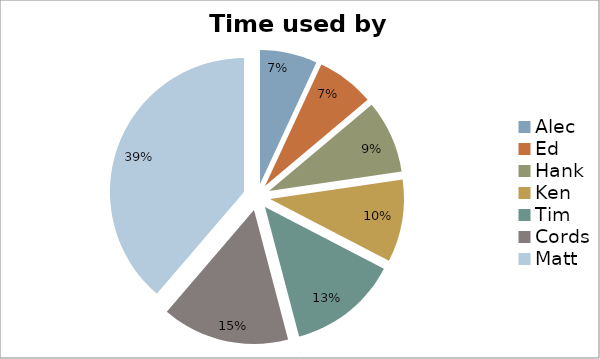
| Category | Series 0 |
|---|---|
| Alec | 205 |
| Ed | 207 |
| Hank | 261 |
| Ken | 295 |
| Tim | 394 |
| Cords | 456 |
| Matt | 1149 |